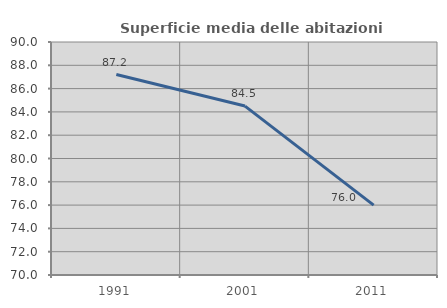
| Category | Superficie media delle abitazioni occupate |
|---|---|
| 1991.0 | 87.205 |
| 2001.0 | 84.5 |
| 2011.0 | 76 |